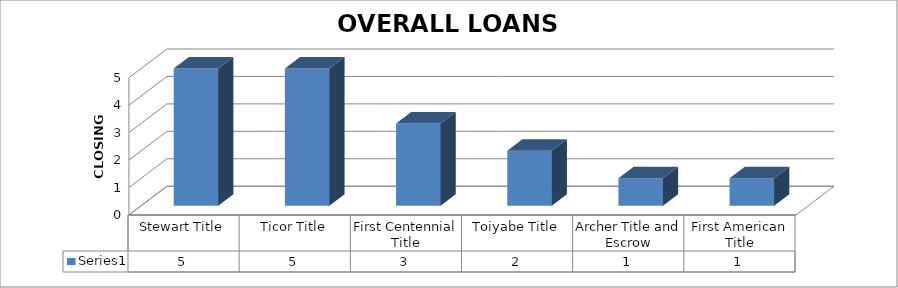
| Category | Series 0 |
|---|---|
| Stewart Title | 5 |
| Ticor Title | 5 |
| First Centennial Title | 3 |
| Toiyabe Title | 2 |
| Archer Title and Escrow | 1 |
| First American Title | 1 |